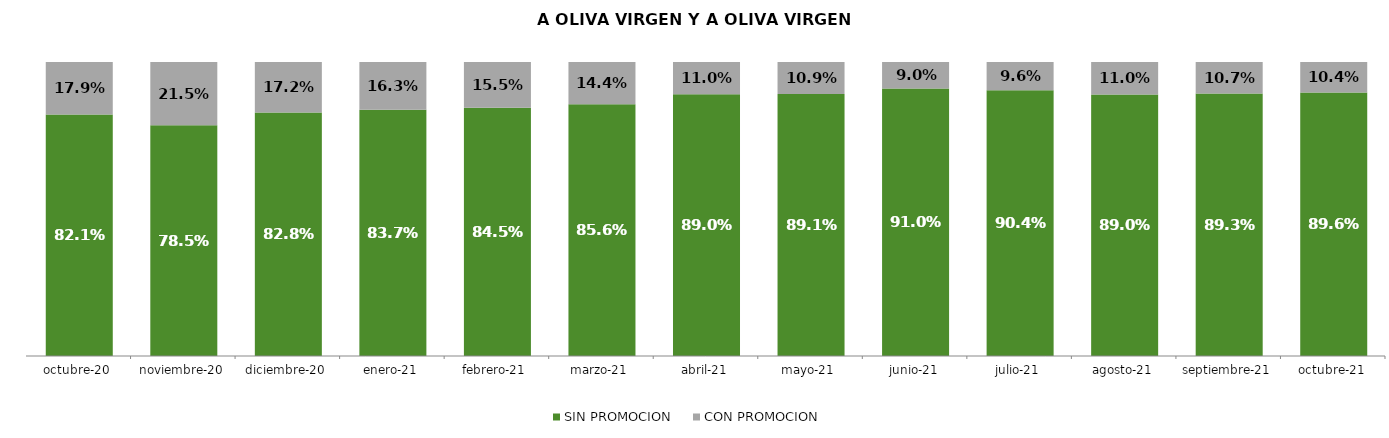
| Category | SIN PROMOCION   | CON PROMOCION   |
|---|---|---|
| 2020-10-01 | 0.821 | 0.179 |
| 2020-11-01 | 0.785 | 0.215 |
| 2020-12-01 | 0.828 | 0.172 |
| 2021-01-01 | 0.837 | 0.163 |
| 2021-02-01 | 0.845 | 0.155 |
| 2021-03-01 | 0.856 | 0.144 |
| 2021-04-01 | 0.89 | 0.11 |
| 2021-05-01 | 0.891 | 0.109 |
| 2021-06-01 | 0.91 | 0.09 |
| 2021-07-01 | 0.904 | 0.096 |
| 2021-08-01 | 0.89 | 0.11 |
| 2021-09-01 | 0.893 | 0.107 |
| 2021-10-01 | 0.896 | 0.104 |